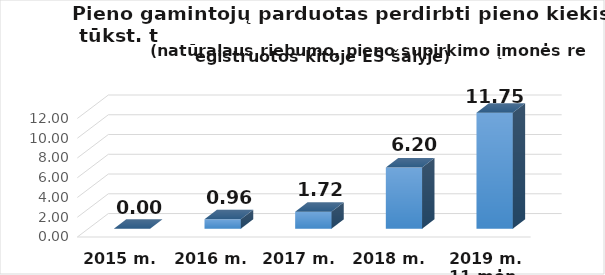
| Category | Kitoje ES šalyje registruotam ūkio subjektui  |
|---|---|
| 2015 m. | 0 |
| 2016 m. | 0.96 |
| 2017 m.  | 1.72 |
| 2018 m.  | 6.2 |
| 2019 m. 11 mėn. | 11.75 |